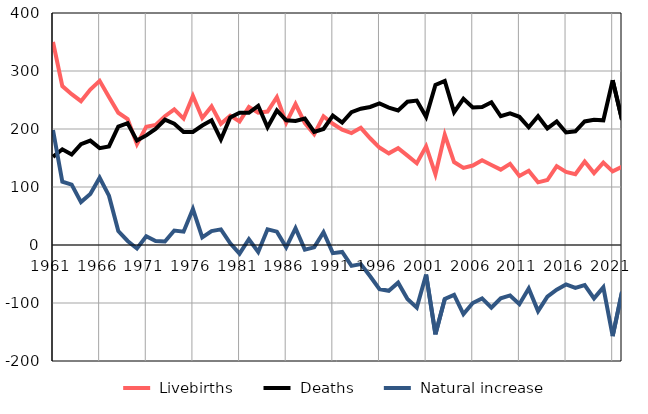
| Category |  Livebirths |  Deaths |  Natural increase |
|---|---|---|---|
| 1961.0 | 350 | 152 | 198 |
| 1962.0 | 274 | 165 | 109 |
| 1963.0 | 260 | 156 | 104 |
| 1964.0 | 248 | 174 | 74 |
| 1965.0 | 268 | 180 | 88 |
| 1966.0 | 283 | 167 | 116 |
| 1967.0 | 255 | 170 | 85 |
| 1968.0 | 228 | 204 | 24 |
| 1969.0 | 217 | 210 | 7 |
| 1970.0 | 174 | 180 | -6 |
| 1971.0 | 204 | 189 | 15 |
| 1972.0 | 207 | 200 | 7 |
| 1973.0 | 222 | 216 | 6 |
| 1974.0 | 234 | 209 | 25 |
| 1975.0 | 218 | 195 | 23 |
| 1976.0 | 257 | 195 | 62 |
| 1977.0 | 219 | 206 | 13 |
| 1978.0 | 239 | 215 | 24 |
| 1979.0 | 209 | 182 | 27 |
| 1980.0 | 223 | 220 | 3 |
| 1981.0 | 213 | 228 | -15 |
| 1982.0 | 238 | 228 | 10 |
| 1983.0 | 228 | 240 | -12 |
| 1984.0 | 230 | 203 | 27 |
| 1985.0 | 255 | 232 | 23 |
| 1986.0 | 211 | 215 | -4 |
| 1987.0 | 243 | 214 | 29 |
| 1988.0 | 210 | 218 | -8 |
| 1989.0 | 191 | 195 | -4 |
| 1990.0 | 222 | 200 | 22 |
| 1991.0 | 209 | 223 | -14 |
| 1992.0 | 199 | 211 | -12 |
| 1993.0 | 193 | 229 | -36 |
| 1994.0 | 202 | 235 | -33 |
| 1995.0 | 184 | 238 | -54 |
| 1996.0 | 168 | 244 | -76 |
| 1997.0 | 158 | 237 | -79 |
| 1998.0 | 167 | 232 | -65 |
| 1999.0 | 154 | 247 | -93 |
| 2000.0 | 141 | 249 | -108 |
| 2001.0 | 170 | 221 | -51 |
| 2002.0 | 122 | 276 | -154 |
| 2003.0 | 190 | 283 | -93 |
| 2004.0 | 143 | 229 | -86 |
| 2005.0 | 133 | 252 | -119 |
| 2006.0 | 137 | 237 | -100 |
| 2007.0 | 146 | 238 | -92 |
| 2008.0 | 138 | 246 | -108 |
| 2009.0 | 130 | 222 | -92 |
| 2010.0 | 140 | 227 | -87 |
| 2011.0 | 119 | 221 | -102 |
| 2012.0 | 128 | 203 | -75 |
| 2013.0 | 108 | 222 | -114 |
| 2014.0 | 112 | 201 | -89 |
| 2015.0 | 136 | 213 | -77 |
| 2016.0 | 126 | 194 | -68 |
| 2017.0 | 122 | 196 | -74 |
| 2018.0 | 144 | 213 | -69 |
| 2019.0 | 124 | 216 | -92 |
| 2020.0 | 142 | 215 | -73 |
| 2021.0 | 127 | 284 | -157 |
| 2022.0 | 135 | 216 | -81 |